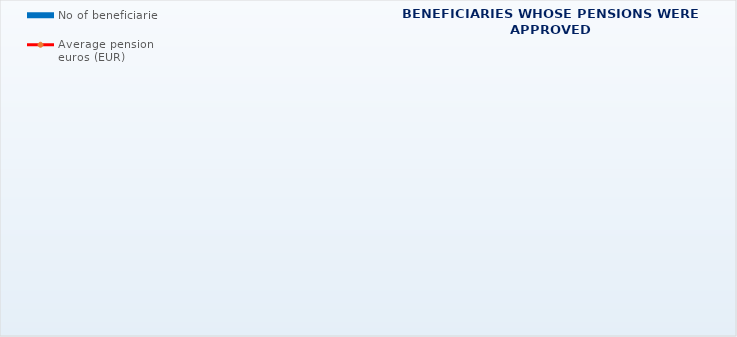
| Category | No of beneficiaries |
|---|---|
| Authorised officials in internal affairs, judicial officers and workers engaged in demining work: | 17183 |
| Pension beneficiaries entitled under the Fire Services Act (Official Gazette 125/19) | 357 |
| Active military personnel - DVO  | 16043 |
| Croatian Homeland Army veterans mobilised from 1941 to 1945 | 1862 |
| Former political prisoners | 2057 |
| Croatian Veterans from the Homeland War - ZOHBDR (Act on Croatian Homeland War Veterans and Their Family Members) | 71271 |
| Pensions approved under general regulations and determined according to the Act on the Rights of Croatian Homeland War Veterans and their Family Members (ZOHBDR), in 2017 (Art. 27, 35, 48 and 49, paragraph 2)    | 57742 |
| Former Yugoslav People's Army members - JNA   | 3610 |
| Former Yugoslav People's Army members - JNA - Art. 185 of Pension Insurance Act (ZOMO)  | 156 |
| National Liberation War veterans - NOR | 4850 |
| Members of the Croatian Parliament, members of the Government, judges of the Constitutional Court and the Auditor General | 679 |
| Members of the Parliamentary Executive Council and administratively retired federal civil servants  (relates to the former SFRY) | 64 |
| Former officials of federal bodies o the former SFRJ -  Article 38 of the Pension Insurance Act (ZOMO) | 17 |
| Full members of the Croatian Academy of Sciences and Arts - HAZU | 124 |
| Miners from the Istrian coal mines "Tupljak" d.d. Labin  | 245 |
| Workers professionally exposed to asbestos | 816 |
| Insurees - crew members on a ship in international and national navigation  - Article  129, paragraph 2 of the Maritime Code | 204 |
| Members of the Croatian Defence Council - HVO  | 6729 |